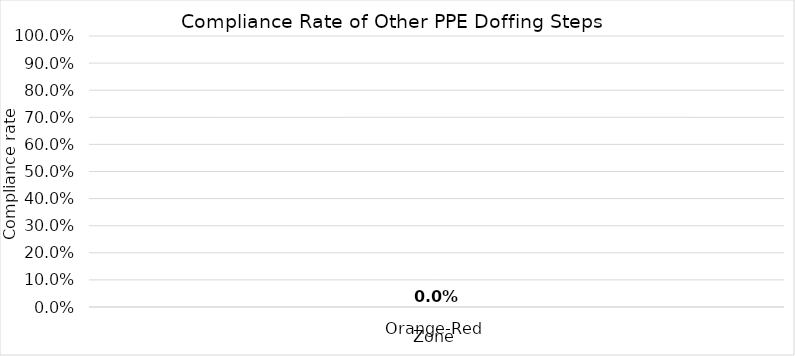
| Category | Compliance |
|---|---|
| Orange-Red | 0 |